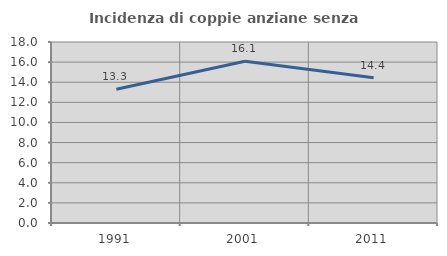
| Category | Incidenza di coppie anziane senza figli  |
|---|---|
| 1991.0 | 13.306 |
| 2001.0 | 16.092 |
| 2011.0 | 14.444 |